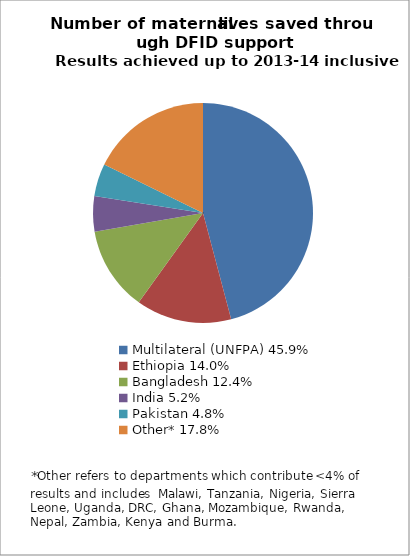
| Category | Series 0 |
|---|---|
| Multilateral (UNFPA) 45.9% | 45.878 |
| Ethiopia 14.0% | 14.043 |
| Bangladesh 12.4% | 12.358 |
| India 5.2% | 5.196 |
| Pakistan 4.8% | 4.775 |
| Other* 17.8% | 17.75 |